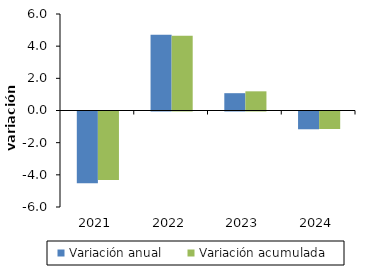
| Category | Variación anual | Variación acumulada |
|---|---|---|
| 2021-02-01 | -4.456 | -4.252 |
| 2022-02-01 | 4.714 | 4.645 |
| 2023-02-01 | 1.076 | 1.193 |
| 2024-02-01 | -1.105 | -1.088 |